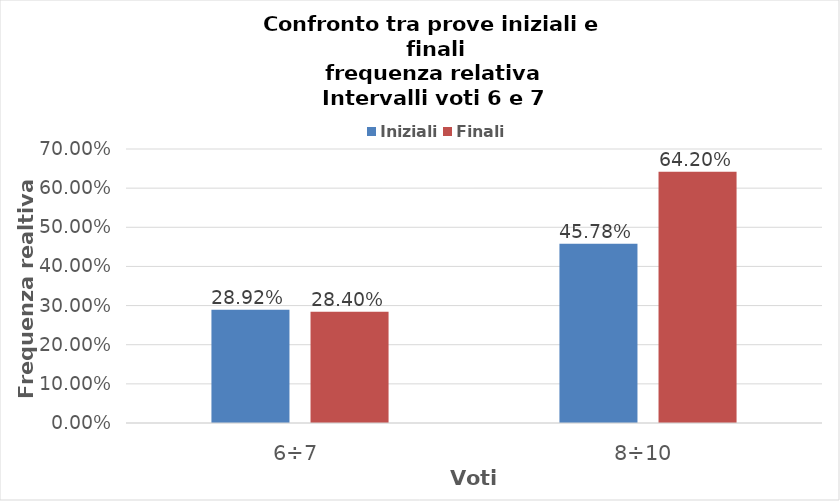
| Category | Iniziali | Finali |
|---|---|---|
| 6÷7 | 0.289 | 0.284 |
| 8÷10 | 0.458 | 0.642 |